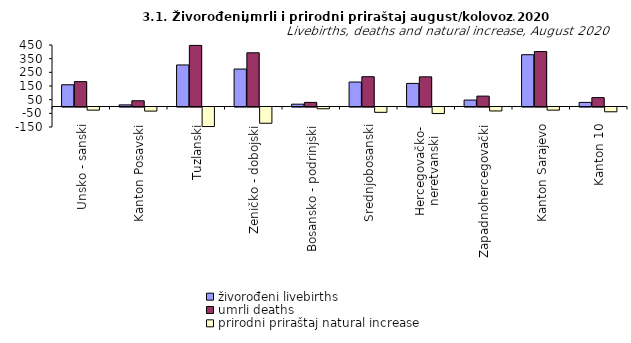
| Category | živorođeni livebirths | umrli deaths | prirodni priraštaj natural increase |
|---|---|---|---|
| Unsko - sanski | 159 | 182 | -23 |
| Kanton Posavski | 12 | 42 | -30 |
| Tuzlanski | 304 | 447 | -143 |
| Zeničko - dobojski | 274 | 393 | -119 |
| Bosansko - podrinjski | 17 | 30 | -13 |
| Srednjobosanski | 179 | 218 | -39 |
| Hercegovačko-
neretvanski | 169 | 217 | -48 |
| Zapadnohercegovački | 47 | 76 | -29 |
| Kanton Sarajevo | 379 | 402 | -23 |
| Kanton 10 | 30 | 65 | -35 |